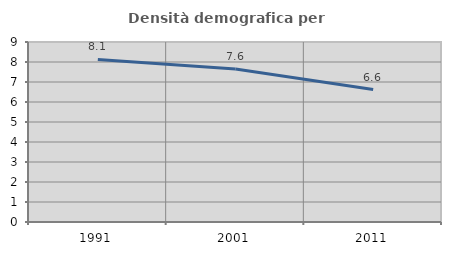
| Category | Densità demografica |
|---|---|
| 1991.0 | 8.131 |
| 2001.0 | 7.65 |
| 2011.0 | 6.624 |